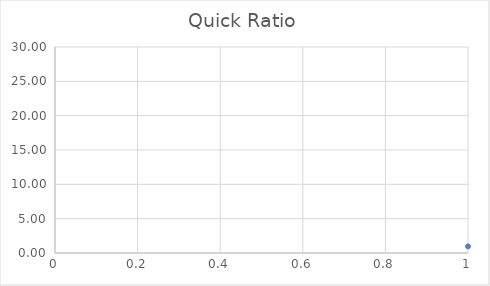
| Category | Series 0 |
|---|---|
| 0 | 0.965 |
| 1 | 1.043 |
| 2 | 1.074 |
| 3 | 1.103 |
| 4 | 1.117 |
| 5 | 1.234 |
| 6 | 1.286 |
| 7 | 1.333 |
| 8 | 1.361 |
| 9 | 1.461 |
| 10 | 1.708 |
| 11 | 1.716 |
| 12 | 1.75 |
| 13 | 1.758 |
| 14 | 1.759 |
| 15 | 1.911 |
| 16 | 1.986 |
| 17 | 1.99 |
| 18 | 2.096 |
| 19 | 2.18 |
| 20 | 2.189 |
| 21 | 2.262 |
| 22 | 2.321 |
| 23 | 2.337 |
| 24 | 2.386 |
| 25 | 2.52 |
| 26 | 2.547 |
| 27 | 2.712 |
| 28 | 2.863 |
| 29 | 2.885 |
| 30 | 3.035 |
| 31 | 3.318 |
| 32 | 3.345 |
| 33 | 3.347 |
| 34 | 3.517 |
| 35 | 3.766 |
| 36 | 3.785 |
| 37 | 4.664 |
| 38 | 4.774 |
| 39 | 4.886 |
| 40 | 5.066 |
| 41 | 5.167 |
| 42 | 5.214 |
| 43 | 5.789 |
| 44 | 6.883 |
| 45 | 7.432 |
| 46 | 8.359 |
| 47 | 9.769 |
| 48 | 9.993 |
| 49 | 25.129 |